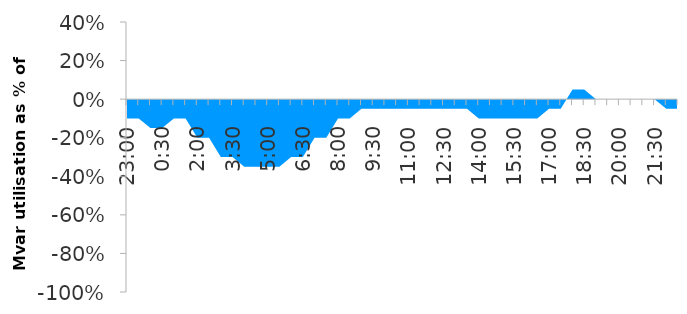
| Category | Series 1 |
|---|---|
| 0.9583333333333334 | -0.1 |
| 0.9791666666666666 | -0.1 |
| 0.0 | -0.15 |
| 0.020833333333333332 | -0.15 |
| 0.041666666666666664 | -0.1 |
| 0.0625 | -0.1 |
| 0.08333333333333333 | -0.2 |
| 0.10416666666666667 | -0.2 |
| 0.125 | -0.3 |
| 0.14583333333333334 | -0.3 |
| 0.16666666666666666 | -0.35 |
| 0.1875 | -0.35 |
| 0.20833333333333334 | -0.35 |
| 0.22916666666666666 | -0.35 |
| 0.25 | -0.3 |
| 0.2708333333333333 | -0.3 |
| 0.2916666666666667 | -0.2 |
| 0.3125 | -0.2 |
| 0.3333333333333333 | -0.1 |
| 0.3541666666666667 | -0.1 |
| 0.375 | -0.05 |
| 0.3958333333333333 | -0.05 |
| 0.4166666666666667 | -0.05 |
| 0.4375 | -0.05 |
| 0.4583333333333333 | -0.05 |
| 0.4791666666666667 | -0.05 |
| 0.5 | -0.05 |
| 0.5208333333333334 | -0.05 |
| 0.5416666666666666 | -0.05 |
| 0.5625 | -0.05 |
| 0.5833333333333334 | -0.1 |
| 0.6041666666666666 | -0.1 |
| 0.625 | -0.1 |
| 0.6458333333333334 | -0.1 |
| 0.6666666666666666 | -0.1 |
| 0.6875 | -0.1 |
| 0.7083333333333334 | -0.05 |
| 0.7291666666666666 | -0.05 |
| 0.75 | 0.05 |
| 0.7708333333333334 | 0.05 |
| 0.7916666666666666 | 0 |
| 0.8125 | 0 |
| 0.8333333333333334 | 0 |
| 0.8541666666666666 | 0 |
| 0.875 | 0 |
| 0.8958333333333334 | 0 |
| 0.9166666666666666 | -0.05 |
| 0.9375 | -0.05 |